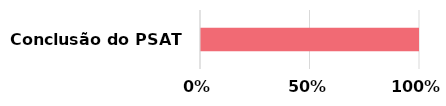
| Category | Series 0 | Series 1 |
|---|---|---|
| Conclusão do PSAT | 0 | 1 |